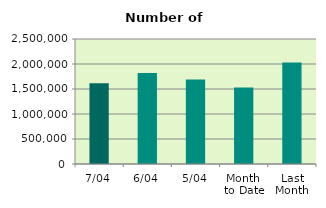
| Category | Series 0 |
|---|---|
| 7/04 | 1616532 |
| 6/04 | 1821556 |
| 5/04 | 1691520 |
| Month 
to Date | 1529726 |
| Last
Month | 2030137.913 |